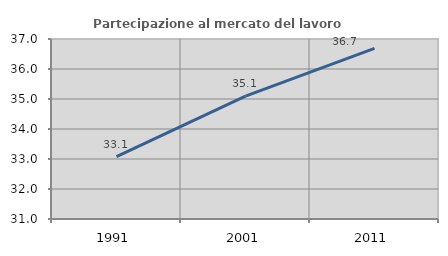
| Category | Partecipazione al mercato del lavoro  femminile |
|---|---|
| 1991.0 | 33.076 |
| 2001.0 | 35.095 |
| 2011.0 | 36.69 |